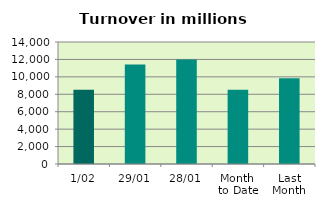
| Category | Series 0 |
|---|---|
| 1/02 | 8508.502 |
| 29/01 | 11426.977 |
| 28/01 | 11988.87 |
| Month 
to Date | 8508.502 |
| Last
Month | 9845.773 |